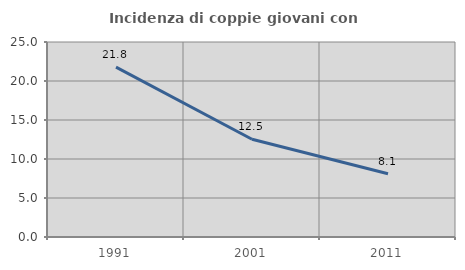
| Category | Incidenza di coppie giovani con figli |
|---|---|
| 1991.0 | 21.788 |
| 2001.0 | 12.531 |
| 2011.0 | 8.111 |